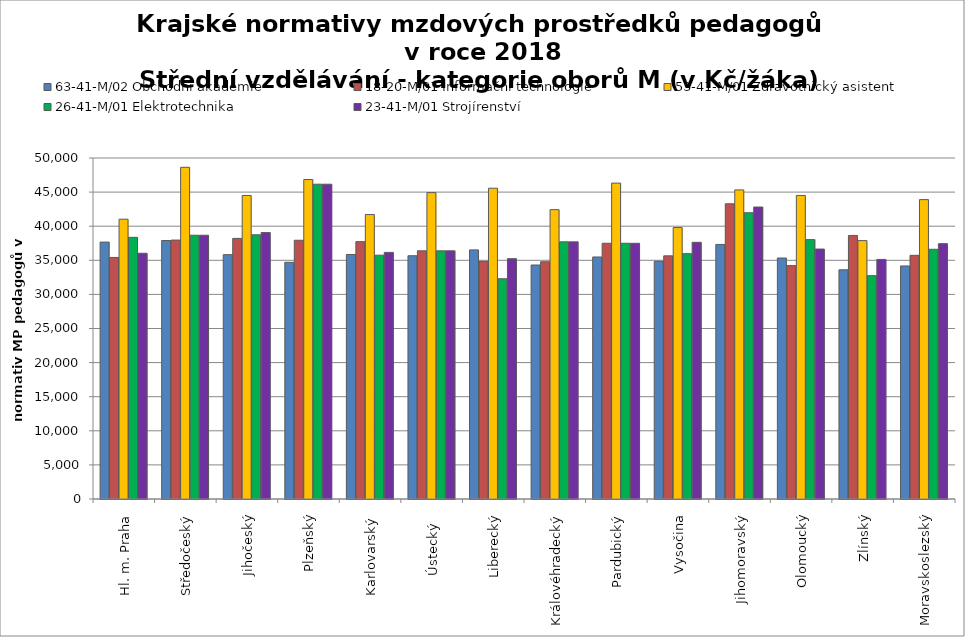
| Category | 63-41-M/02 Obchodní akademie | 18-20-M/01 Informační technologie | 53-41-M/01 Zdravotnický asistent | 26-41-M/01 Elektrotechnika | 23-41-M/01 Strojírenství |
|---|---|---|---|---|---|
| Hl. m. Praha | 37669.091 | 35415.385 | 41025.743 | 38366.667 | 36031.304 |
| Středočeský | 37899.078 | 37966.607 | 48635.163 | 38674.06 | 38674.06 |
| Jihočeský | 35827.187 | 38211.055 | 44505.961 | 38739.318 | 39063.346 |
| Plzeňský | 34705.823 | 37939.483 | 46841.002 | 46157.576 | 46157.576 |
| Karlovarský  | 35852.969 | 37738.095 | 41710.526 | 35751.88 | 36159.696 |
| Ústecký   | 35668.809 | 36391.128 | 44925.714 | 36391.128 | 36391.128 |
| Liberecký | 36527.019 | 34837.432 | 45571.326 | 32292.673 | 35236.521 |
| Královéhradecký | 34309.091 | 34786.435 | 42422.481 | 37704.43 | 37704.43 |
| Pardubický | 35486.786 | 37495.472 | 46323.077 | 37495.472 | 37495.472 |
| Vysočina | 34849.64 | 35651.273 | 39798.883 | 35970.237 | 37637.223 |
| Jihomoravský | 37324.587 | 43287.097 | 45321.764 | 41973.557 | 42815.157 |
| Olomoucký | 35332.763 | 34220.381 | 44508.621 | 38033.149 | 36649.512 |
| Zlínský | 33603.13 | 38643.6 | 37885.882 | 32748.814 | 35130.545 |
| Moravskoslezský | 34171.334 | 35731.266 | 43898.413 | 36614.298 | 37440.433 |